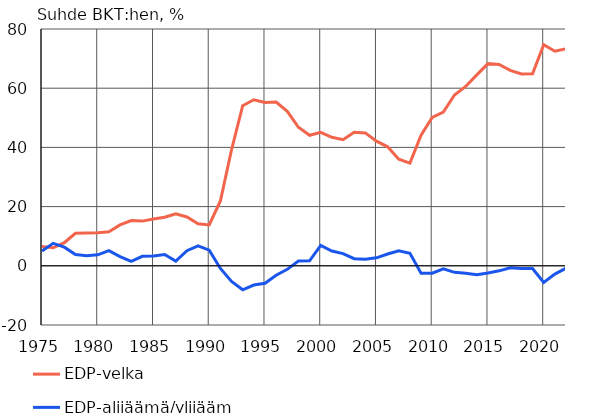
| Category | EDP-velka | EDP-alijäämä/ylijäämä |
|---|---|---|
| 1975 | 6.5 | 5 |
| 1976 | 6.1 | 7.6 |
| 1977 | 7.8 | 6.3 |
| 1978 | 11 | 3.8 |
| 1979 | 11.1 | 3.4 |
| 1980 | 11.2 | 3.7 |
| 1981 | 11.5 | 5.1 |
| 1982 | 13.8 | 3.1 |
| 1983 | 15.3 | 1.5 |
| 1984 | 15.1 | 3.2 |
| 1985 | 15.8 | 3.3 |
| 1986 | 16.4 | 3.8 |
| 1987 | 17.6 | 1.6 |
| 1988 | 16.5 | 5.1 |
| 1989 | 14.2 | 6.7 |
| 1990 | 13.8 | 5.3 |
| 1991 | 21.9 | -0.9 |
| 1992 | 39.2 | -5.3 |
| 1993 | 54.1 | -8.1 |
| 1994 | 56.1 | -6.5 |
| 1995 | 55.2 | -5.9 |
| 1996 | 55.3 | -3.2 |
| 1997 | 52.2 | -1.2 |
| 1998 | 46.8 | 1.6 |
| 1999 | 44.1 | 1.7 |
| 2000 | 45.1 | 6.9 |
| 2001 | 43.4 | 5 |
| 2002 | 42.6 | 4.1 |
| 2003 | 45.1 | 2.4 |
| 2004 | 44.9 | 2.2 |
| 2005 | 42.1 | 2.7 |
| 2006 | 40.2 | 4 |
| 2007 | 36 | 5.1 |
| 2008 | 34.7 | 4.2 |
| 2009 | 44.1 | -2.5 |
| 2010 | 50.1 | -2.5 |
| 2011 | 51.9 | -1 |
| 2012 | 57.7 | -2.2 |
| 2013 | 60.6 | -2.5 |
| 2014 | 64.5 | -3 |
| 2015 | 68.3 | -2.4 |
| 2016 | 68 | -1.7 |
| 2017 | 66 | -0.7 |
| 2018 | 64.8 | -0.9 |
| 2019 | 64.9 | -0.9 |
| 2020 | 74.7 | -5.6 |
| 2021* | 72.5 | -2.8 |
| 2022* | 73.3 | -0.8 |